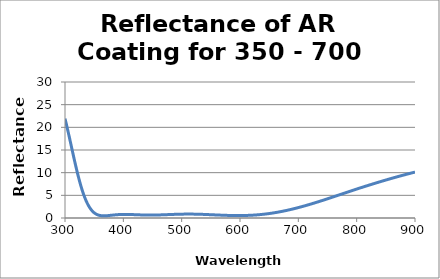
| Category | Reflectance (%) |
|---|---|
| 300.0 | 21.915 |
| 301.0 | 21.398 |
| 302.0 | 20.869 |
| 303.0 | 20.327 |
| 304.0 | 19.776 |
| 305.0 | 19.216 |
| 306.0 | 18.648 |
| 307.0 | 18.074 |
| 308.0 | 17.496 |
| 309.0 | 16.914 |
| 310.0 | 16.329 |
| 311.0 | 15.744 |
| 312.0 | 15.158 |
| 313.0 | 14.575 |
| 314.0 | 13.994 |
| 315.0 | 13.417 |
| 316.0 | 12.845 |
| 317.0 | 12.28 |
| 318.0 | 11.722 |
| 319.0 | 11.172 |
| 320.0 | 10.632 |
| 321.0 | 10.102 |
| 322.0 | 9.584 |
| 323.0 | 9.078 |
| 324.0 | 8.584 |
| 325.0 | 8.105 |
| 326.0 | 7.64 |
| 327.0 | 7.189 |
| 328.0 | 6.754 |
| 329.0 | 6.334 |
| 330.0 | 5.931 |
| 331.0 | 5.543 |
| 332.0 | 5.172 |
| 333.0 | 4.817 |
| 334.0 | 4.479 |
| 335.0 | 4.158 |
| 336.0 | 3.854 |
| 337.0 | 3.565 |
| 338.0 | 3.293 |
| 339.0 | 3.037 |
| 340.0 | 2.797 |
| 341.0 | 2.571 |
| 342.0 | 2.361 |
| 343.0 | 2.165 |
| 344.0 | 1.983 |
| 345.0 | 1.815 |
| 346.0 | 1.66 |
| 347.0 | 1.517 |
| 348.0 | 1.386 |
| 349.0 | 1.266 |
| 350.0 | 1.158 |
| 351.0 | 1.059 |
| 352.0 | 0.97 |
| 353.0 | 0.891 |
| 354.0 | 0.821 |
| 355.0 | 0.759 |
| 356.0 | 0.704 |
| 357.0 | 0.657 |
| 358.0 | 0.617 |
| 359.0 | 0.582 |
| 360.0 | 0.554 |
| 361.0 | 0.531 |
| 362.0 | 0.512 |
| 363.0 | 0.498 |
| 364.0 | 0.488 |
| 365.0 | 0.482 |
| 366.0 | 0.479 |
| 367.0 | 0.479 |
| 368.0 | 0.481 |
| 369.0 | 0.486 |
| 370.0 | 0.492 |
| 371.0 | 0.5 |
| 372.0 | 0.51 |
| 373.0 | 0.521 |
| 374.0 | 0.533 |
| 375.0 | 0.545 |
| 376.0 | 0.558 |
| 377.0 | 0.572 |
| 378.0 | 0.586 |
| 379.0 | 0.6 |
| 380.0 | 0.614 |
| 381.0 | 0.628 |
| 382.0 | 0.642 |
| 383.0 | 0.655 |
| 384.0 | 0.668 |
| 385.0 | 0.68 |
| 386.0 | 0.692 |
| 387.0 | 0.704 |
| 388.0 | 0.715 |
| 389.0 | 0.725 |
| 390.0 | 0.734 |
| 391.0 | 0.743 |
| 392.0 | 0.751 |
| 393.0 | 0.758 |
| 394.0 | 0.764 |
| 395.0 | 0.77 |
| 396.0 | 0.775 |
| 397.0 | 0.779 |
| 398.0 | 0.783 |
| 399.0 | 0.786 |
| 400.0 | 0.788 |
| 401.0 | 0.789 |
| 402.0 | 0.79 |
| 403.0 | 0.79 |
| 404.0 | 0.79 |
| 405.0 | 0.789 |
| 406.0 | 0.788 |
| 407.0 | 0.786 |
| 408.0 | 0.784 |
| 409.0 | 0.781 |
| 410.0 | 0.778 |
| 411.0 | 0.775 |
| 412.0 | 0.771 |
| 413.0 | 0.767 |
| 414.0 | 0.763 |
| 415.0 | 0.758 |
| 416.0 | 0.754 |
| 417.0 | 0.749 |
| 418.0 | 0.744 |
| 419.0 | 0.739 |
| 420.0 | 0.734 |
| 421.0 | 0.728 |
| 422.0 | 0.723 |
| 423.0 | 0.718 |
| 424.0 | 0.713 |
| 425.0 | 0.708 |
| 426.0 | 0.703 |
| 427.0 | 0.698 |
| 428.0 | 0.693 |
| 429.0 | 0.689 |
| 430.0 | 0.684 |
| 431.0 | 0.68 |
| 432.0 | 0.676 |
| 433.0 | 0.672 |
| 434.0 | 0.669 |
| 435.0 | 0.666 |
| 436.0 | 0.662 |
| 437.0 | 0.659 |
| 438.0 | 0.657 |
| 439.0 | 0.654 |
| 440.0 | 0.652 |
| 441.0 | 0.651 |
| 442.0 | 0.649 |
| 443.0 | 0.648 |
| 444.0 | 0.648 |
| 445.0 | 0.647 |
| 446.0 | 0.647 |
| 447.0 | 0.647 |
| 448.0 | 0.648 |
| 449.0 | 0.649 |
| 450.0 | 0.65 |
| 451.0 | 0.651 |
| 452.0 | 0.652 |
| 453.0 | 0.654 |
| 454.0 | 0.656 |
| 455.0 | 0.658 |
| 456.0 | 0.661 |
| 457.0 | 0.663 |
| 458.0 | 0.666 |
| 459.0 | 0.669 |
| 460.0 | 0.673 |
| 461.0 | 0.676 |
| 462.0 | 0.68 |
| 463.0 | 0.684 |
| 464.0 | 0.688 |
| 465.0 | 0.692 |
| 466.0 | 0.696 |
| 467.0 | 0.701 |
| 468.0 | 0.706 |
| 469.0 | 0.71 |
| 470.0 | 0.715 |
| 471.0 | 0.72 |
| 472.0 | 0.725 |
| 473.0 | 0.73 |
| 474.0 | 0.735 |
| 475.0 | 0.74 |
| 476.0 | 0.745 |
| 477.0 | 0.75 |
| 478.0 | 0.755 |
| 479.0 | 0.76 |
| 480.0 | 0.766 |
| 481.0 | 0.77 |
| 482.0 | 0.776 |
| 483.0 | 0.78 |
| 484.0 | 0.785 |
| 485.0 | 0.79 |
| 486.0 | 0.795 |
| 487.0 | 0.799 |
| 488.0 | 0.804 |
| 489.0 | 0.808 |
| 490.0 | 0.812 |
| 491.0 | 0.817 |
| 492.0 | 0.821 |
| 493.0 | 0.824 |
| 494.0 | 0.828 |
| 495.0 | 0.832 |
| 496.0 | 0.835 |
| 497.0 | 0.838 |
| 498.0 | 0.841 |
| 499.0 | 0.844 |
| 500.0 | 0.847 |
| 501.0 | 0.849 |
| 502.0 | 0.851 |
| 503.0 | 0.854 |
| 504.0 | 0.855 |
| 505.0 | 0.857 |
| 506.0 | 0.858 |
| 507.0 | 0.86 |
| 508.0 | 0.86 |
| 509.0 | 0.861 |
| 510.0 | 0.862 |
| 511.0 | 0.862 |
| 512.0 | 0.862 |
| 513.0 | 0.862 |
| 514.0 | 0.862 |
| 515.0 | 0.861 |
| 516.0 | 0.86 |
| 517.0 | 0.86 |
| 518.0 | 0.858 |
| 519.0 | 0.857 |
| 520.0 | 0.855 |
| 521.0 | 0.853 |
| 522.0 | 0.851 |
| 523.0 | 0.849 |
| 524.0 | 0.847 |
| 525.0 | 0.844 |
| 526.0 | 0.841 |
| 527.0 | 0.838 |
| 528.0 | 0.835 |
| 529.0 | 0.831 |
| 530.0 | 0.828 |
| 531.0 | 0.824 |
| 532.0 | 0.82 |
| 533.0 | 0.816 |
| 534.0 | 0.812 |
| 535.0 | 0.807 |
| 536.0 | 0.802 |
| 537.0 | 0.798 |
| 538.0 | 0.793 |
| 539.0 | 0.788 |
| 540.0 | 0.783 |
| 541.0 | 0.777 |
| 542.0 | 0.772 |
| 543.0 | 0.766 |
| 544.0 | 0.761 |
| 545.0 | 0.755 |
| 546.0 | 0.749 |
| 547.0 | 0.743 |
| 548.0 | 0.737 |
| 549.0 | 0.731 |
| 550.0 | 0.725 |
| 551.0 | 0.72 |
| 552.0 | 0.714 |
| 553.0 | 0.708 |
| 554.0 | 0.703 |
| 555.0 | 0.697 |
| 556.0 | 0.692 |
| 557.0 | 0.686 |
| 558.0 | 0.68 |
| 559.0 | 0.675 |
| 560.0 | 0.669 |
| 561.0 | 0.663 |
| 562.0 | 0.658 |
| 563.0 | 0.652 |
| 564.0 | 0.647 |
| 565.0 | 0.642 |
| 566.0 | 0.636 |
| 567.0 | 0.631 |
| 568.0 | 0.626 |
| 569.0 | 0.621 |
| 570.0 | 0.616 |
| 571.0 | 0.611 |
| 572.0 | 0.606 |
| 573.0 | 0.601 |
| 574.0 | 0.597 |
| 575.0 | 0.592 |
| 576.0 | 0.588 |
| 577.0 | 0.584 |
| 578.0 | 0.58 |
| 579.0 | 0.576 |
| 580.0 | 0.572 |
| 581.0 | 0.569 |
| 582.0 | 0.565 |
| 583.0 | 0.562 |
| 584.0 | 0.559 |
| 585.0 | 0.556 |
| 586.0 | 0.554 |
| 587.0 | 0.551 |
| 588.0 | 0.549 |
| 589.0 | 0.547 |
| 590.0 | 0.545 |
| 591.0 | 0.544 |
| 592.0 | 0.542 |
| 593.0 | 0.541 |
| 594.0 | 0.54 |
| 595.0 | 0.539 |
| 596.0 | 0.539 |
| 597.0 | 0.539 |
| 598.0 | 0.539 |
| 599.0 | 0.539 |
| 600.0 | 0.54 |
| 601.0 | 0.541 |
| 602.0 | 0.542 |
| 603.0 | 0.543 |
| 604.0 | 0.545 |
| 605.0 | 0.547 |
| 606.0 | 0.549 |
| 607.0 | 0.552 |
| 608.0 | 0.555 |
| 609.0 | 0.558 |
| 610.0 | 0.562 |
| 611.0 | 0.566 |
| 612.0 | 0.57 |
| 613.0 | 0.574 |
| 614.0 | 0.579 |
| 615.0 | 0.584 |
| 616.0 | 0.589 |
| 617.0 | 0.595 |
| 618.0 | 0.601 |
| 619.0 | 0.608 |
| 620.0 | 0.614 |
| 621.0 | 0.622 |
| 622.0 | 0.629 |
| 623.0 | 0.637 |
| 624.0 | 0.645 |
| 625.0 | 0.653 |
| 626.0 | 0.662 |
| 627.0 | 0.672 |
| 628.0 | 0.681 |
| 629.0 | 0.691 |
| 630.0 | 0.701 |
| 631.0 | 0.712 |
| 632.0 | 0.723 |
| 633.0 | 0.734 |
| 634.0 | 0.746 |
| 635.0 | 0.758 |
| 636.0 | 0.77 |
| 637.0 | 0.783 |
| 638.0 | 0.796 |
| 639.0 | 0.81 |
| 640.0 | 0.824 |
| 641.0 | 0.838 |
| 642.0 | 0.853 |
| 643.0 | 0.868 |
| 644.0 | 0.883 |
| 645.0 | 0.899 |
| 646.0 | 0.915 |
| 647.0 | 0.931 |
| 648.0 | 0.948 |
| 649.0 | 0.965 |
| 650.0 | 0.983 |
| 651.0 | 1.001 |
| 652.0 | 1.019 |
| 653.0 | 1.038 |
| 654.0 | 1.057 |
| 655.0 | 1.076 |
| 656.0 | 1.096 |
| 657.0 | 1.116 |
| 658.0 | 1.137 |
| 659.0 | 1.158 |
| 660.0 | 1.179 |
| 661.0 | 1.2 |
| 662.0 | 1.222 |
| 663.0 | 1.244 |
| 664.0 | 1.267 |
| 665.0 | 1.29 |
| 666.0 | 1.313 |
| 667.0 | 1.337 |
| 668.0 | 1.361 |
| 669.0 | 1.385 |
| 670.0 | 1.41 |
| 671.0 | 1.435 |
| 672.0 | 1.461 |
| 673.0 | 1.486 |
| 674.0 | 1.512 |
| 675.0 | 1.539 |
| 676.0 | 1.565 |
| 677.0 | 1.592 |
| 678.0 | 1.62 |
| 679.0 | 1.647 |
| 680.0 | 1.675 |
| 681.0 | 1.704 |
| 682.0 | 1.732 |
| 683.0 | 1.761 |
| 684.0 | 1.79 |
| 685.0 | 1.82 |
| 686.0 | 1.85 |
| 687.0 | 1.88 |
| 688.0 | 1.91 |
| 689.0 | 1.941 |
| 690.0 | 1.972 |
| 691.0 | 2.003 |
| 692.0 | 2.035 |
| 693.0 | 2.067 |
| 694.0 | 2.099 |
| 695.0 | 2.131 |
| 696.0 | 2.164 |
| 697.0 | 2.197 |
| 698.0 | 2.23 |
| 699.0 | 2.264 |
| 700.0 | 2.297 |
| 701.0 | 2.331 |
| 702.0 | 2.366 |
| 703.0 | 2.4 |
| 704.0 | 2.435 |
| 705.0 | 2.47 |
| 706.0 | 2.505 |
| 707.0 | 2.54 |
| 708.0 | 2.576 |
| 709.0 | 2.612 |
| 710.0 | 2.648 |
| 711.0 | 2.684 |
| 712.0 | 2.721 |
| 713.0 | 2.758 |
| 714.0 | 2.794 |
| 715.0 | 2.832 |
| 716.0 | 2.869 |
| 717.0 | 2.907 |
| 718.0 | 2.944 |
| 719.0 | 2.982 |
| 720.0 | 3.02 |
| 721.0 | 3.059 |
| 722.0 | 3.097 |
| 723.0 | 3.136 |
| 724.0 | 3.175 |
| 725.0 | 3.214 |
| 726.0 | 3.253 |
| 727.0 | 3.292 |
| 728.0 | 3.332 |
| 729.0 | 3.372 |
| 730.0 | 3.411 |
| 731.0 | 3.451 |
| 732.0 | 3.492 |
| 733.0 | 3.532 |
| 734.0 | 3.572 |
| 735.0 | 3.613 |
| 736.0 | 3.653 |
| 737.0 | 3.694 |
| 738.0 | 3.735 |
| 739.0 | 3.776 |
| 740.0 | 3.817 |
| 741.0 | 3.858 |
| 742.0 | 3.9 |
| 743.0 | 3.941 |
| 744.0 | 3.983 |
| 745.0 | 4.025 |
| 746.0 | 4.066 |
| 747.0 | 4.108 |
| 748.0 | 4.15 |
| 749.0 | 4.192 |
| 750.0 | 4.235 |
| 751.0 | 4.277 |
| 752.0 | 4.319 |
| 753.0 | 4.362 |
| 754.0 | 4.404 |
| 755.0 | 4.446 |
| 756.0 | 4.489 |
| 757.0 | 4.532 |
| 758.0 | 4.574 |
| 759.0 | 4.617 |
| 760.0 | 4.66 |
| 761.0 | 4.703 |
| 762.0 | 4.746 |
| 763.0 | 4.789 |
| 764.0 | 4.832 |
| 765.0 | 4.875 |
| 766.0 | 4.918 |
| 767.0 | 4.961 |
| 768.0 | 5.004 |
| 769.0 | 5.048 |
| 770.0 | 5.091 |
| 771.0 | 5.134 |
| 772.0 | 5.177 |
| 773.0 | 5.22 |
| 774.0 | 5.264 |
| 775.0 | 5.307 |
| 776.0 | 5.35 |
| 777.0 | 5.394 |
| 778.0 | 5.437 |
| 779.0 | 5.48 |
| 780.0 | 5.524 |
| 781.0 | 5.567 |
| 782.0 | 5.61 |
| 783.0 | 5.653 |
| 784.0 | 5.697 |
| 785.0 | 5.74 |
| 786.0 | 5.783 |
| 787.0 | 5.826 |
| 788.0 | 5.87 |
| 789.0 | 5.913 |
| 790.0 | 5.956 |
| 791.0 | 5.999 |
| 792.0 | 6.042 |
| 793.0 | 6.085 |
| 794.0 | 6.128 |
| 795.0 | 6.171 |
| 796.0 | 6.214 |
| 797.0 | 6.257 |
| 798.0 | 6.3 |
| 799.0 | 6.343 |
| 800.0 | 6.386 |
| 801.0 | 6.427 |
| 802.0 | 6.468 |
| 803.0 | 6.51 |
| 804.0 | 6.551 |
| 805.0 | 6.592 |
| 806.0 | 6.633 |
| 807.0 | 6.674 |
| 808.0 | 6.715 |
| 809.0 | 6.756 |
| 810.0 | 6.797 |
| 811.0 | 6.838 |
| 812.0 | 6.878 |
| 813.0 | 6.919 |
| 814.0 | 6.96 |
| 815.0 | 7 |
| 816.0 | 7.041 |
| 817.0 | 7.081 |
| 818.0 | 7.122 |
| 819.0 | 7.162 |
| 820.0 | 7.202 |
| 821.0 | 7.242 |
| 822.0 | 7.283 |
| 823.0 | 7.323 |
| 824.0 | 7.363 |
| 825.0 | 7.403 |
| 826.0 | 7.443 |
| 827.0 | 7.483 |
| 828.0 | 7.522 |
| 829.0 | 7.562 |
| 830.0 | 7.602 |
| 831.0 | 7.641 |
| 832.0 | 7.68 |
| 833.0 | 7.72 |
| 834.0 | 7.759 |
| 835.0 | 7.798 |
| 836.0 | 7.837 |
| 837.0 | 7.876 |
| 838.0 | 7.915 |
| 839.0 | 7.954 |
| 840.0 | 7.993 |
| 841.0 | 8.031 |
| 842.0 | 8.07 |
| 843.0 | 8.108 |
| 844.0 | 8.147 |
| 845.0 | 8.185 |
| 846.0 | 8.223 |
| 847.0 | 8.261 |
| 848.0 | 8.299 |
| 849.0 | 8.337 |
| 850.0 | 8.375 |
| 851.0 | 8.412 |
| 852.0 | 8.45 |
| 853.0 | 8.488 |
| 854.0 | 8.525 |
| 855.0 | 8.562 |
| 856.0 | 8.599 |
| 857.0 | 8.636 |
| 858.0 | 8.673 |
| 859.0 | 8.71 |
| 860.0 | 8.747 |
| 861.0 | 8.784 |
| 862.0 | 8.82 |
| 863.0 | 8.857 |
| 864.0 | 8.893 |
| 865.0 | 8.929 |
| 866.0 | 8.965 |
| 867.0 | 9.001 |
| 868.0 | 9.037 |
| 869.0 | 9.073 |
| 870.0 | 9.109 |
| 871.0 | 9.144 |
| 872.0 | 9.18 |
| 873.0 | 9.215 |
| 874.0 | 9.25 |
| 875.0 | 9.285 |
| 876.0 | 9.32 |
| 877.0 | 9.355 |
| 878.0 | 9.39 |
| 879.0 | 9.425 |
| 880.0 | 9.459 |
| 881.0 | 9.494 |
| 882.0 | 9.528 |
| 883.0 | 9.562 |
| 884.0 | 9.596 |
| 885.0 | 9.63 |
| 886.0 | 9.664 |
| 887.0 | 9.698 |
| 888.0 | 9.731 |
| 889.0 | 9.765 |
| 890.0 | 9.798 |
| 891.0 | 9.831 |
| 892.0 | 9.865 |
| 893.0 | 9.898 |
| 894.0 | 9.93 |
| 895.0 | 9.963 |
| 896.0 | 9.996 |
| 897.0 | 10.028 |
| 898.0 | 10.061 |
| 899.0 | 10.093 |
| 900.0 | 10.125 |